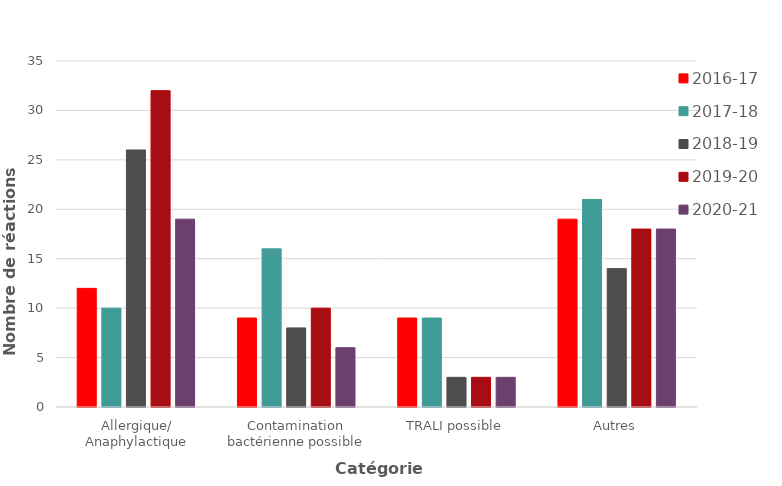
| Category | 2016-17 | 2017-18 | 2018-19 | 2019-20 | 2020-21 |
|---|---|---|---|---|---|
| Allergique/
Anaphylactique | 12 | 10 | 26 | 32 | 19 |
| Contamination bactérienne possible | 9 | 16 | 8 | 10 | 6 |
| TRALI possible | 9 | 9 | 3 | 3 | 3 |
| Autres | 19 | 21 | 14 | 18 | 18 |